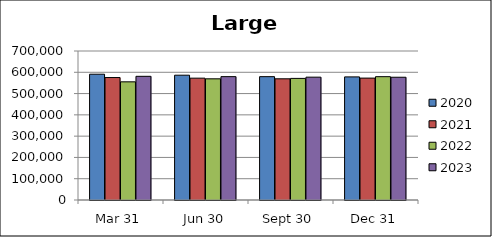
| Category | 2020 | 2021 | 2022 | 2023 |
|---|---|---|---|---|
| Mar 31 | 590925 | 575291 | 555112 | 581037 |
| Jun 30 | 586300 | 572379 | 569307 | 579569 |
| Sept 30 | 579506 | 569393 | 571251 | 577063 |
| Dec 31 | 578427 | 572703 | 579457 | 576720 |